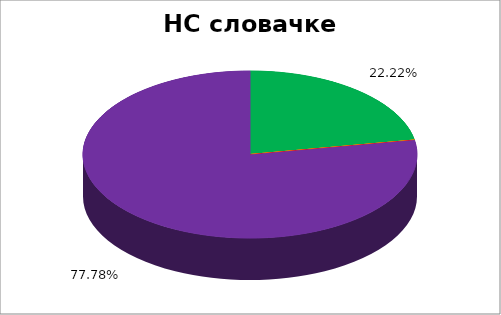
| Category | НС словачке НМ |
|---|---|
| 0 | 0.222 |
| 1 | 0 |
| 2 | 0 |
| 3 | 0 |
| 4 | 0.778 |